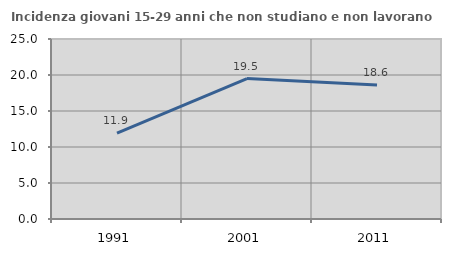
| Category | Incidenza giovani 15-29 anni che non studiano e non lavorano  |
|---|---|
| 1991.0 | 11.929 |
| 2001.0 | 19.51 |
| 2011.0 | 18.616 |